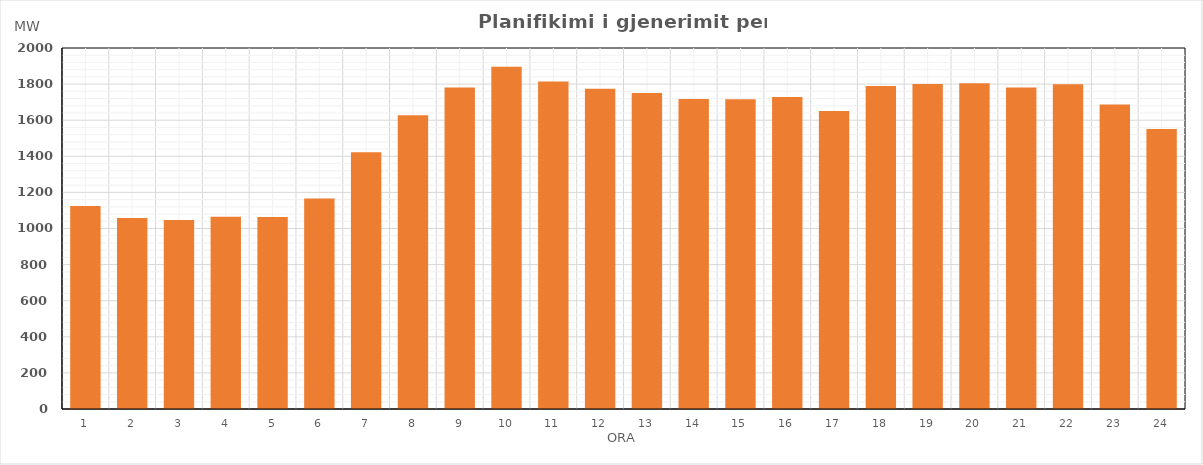
| Category | Max (MW) |
|---|---|
| 0 | 1124.296 |
| 1 | 1057.773 |
| 2 | 1047.007 |
| 3 | 1064.89 |
| 4 | 1063.69 |
| 5 | 1166.264 |
| 6 | 1421.84 |
| 7 | 1627.462 |
| 8 | 1781.474 |
| 9 | 1895.792 |
| 10 | 1814.993 |
| 11 | 1773.735 |
| 12 | 1750.805 |
| 13 | 1717.75 |
| 14 | 1715.97 |
| 15 | 1727.88 |
| 16 | 1651.128 |
| 17 | 1789.177 |
| 18 | 1800.234 |
| 19 | 1804.929 |
| 20 | 1781.621 |
| 21 | 1799.21 |
| 22 | 1686.52 |
| 23 | 1551.301 |